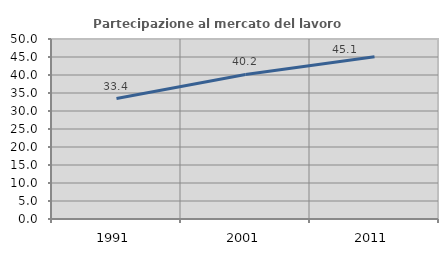
| Category | Partecipazione al mercato del lavoro  femminile |
|---|---|
| 1991.0 | 33.449 |
| 2001.0 | 40.164 |
| 2011.0 | 45.082 |